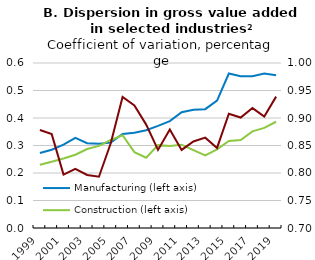
| Category | Manufacturing (left axis) | Construction (left axis) |
|---|---|---|
| 1999.0 | 0.273 | 0.23 |
| 2000.0 | 0.284 | 0.241 |
| 2001.0 | 0.303 | 0.253 |
| 2002.0 | 0.328 | 0.266 |
| 2003.0 | 0.308 | 0.287 |
| 2004.0 | 0.306 | 0.299 |
| 2005.0 | 0.31 | 0.32 |
| 2006.0 | 0.342 | 0.337 |
| 2007.0 | 0.346 | 0.276 |
| 2008.0 | 0.355 | 0.255 |
| 2009.0 | 0.371 | 0.301 |
| 2010.0 | 0.389 | 0.298 |
| 2011.0 | 0.421 | 0.303 |
| 2012.0 | 0.43 | 0.283 |
| 2013.0 | 0.432 | 0.264 |
| 2014.0 | 0.463 | 0.286 |
| 2015.0 | 0.562 | 0.316 |
| 2016.0 | 0.551 | 0.32 |
| 2017.0 | 0.552 | 0.351 |
| 2018.0 | 0.562 | 0.364 |
| 2019.0 | 0.555 | 0.386 |